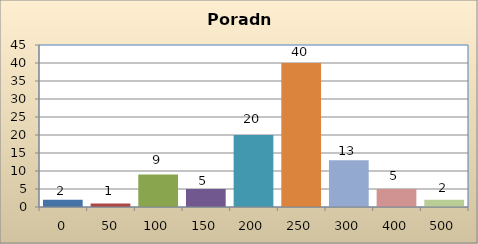
| Category | Series 1 |
|---|---|
| 0.0 | 2 |
| 50.0 | 1 |
| 100.0 | 9 |
| 150.0 | 5 |
| 200.0 | 20 |
| 250.0 | 40 |
| 300.0 | 13 |
| 400.0 | 5 |
| 500.0 | 2 |